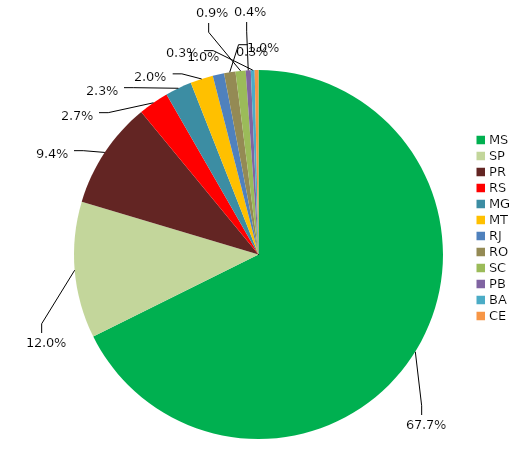
| Category | Series 0 |
|---|---|
| MS | 0.663 |
| SP | 0.117 |
| PR | 0.092 |
| RS | 0.026 |
| MG | 0.023 |
| MT | 0.02 |
| RJ | 0.01 |
| RO | 0.01 |
| SC | 0.009 |
| PB | 0.004 |
| BA | 0.003 |
| CE | 0.003 |